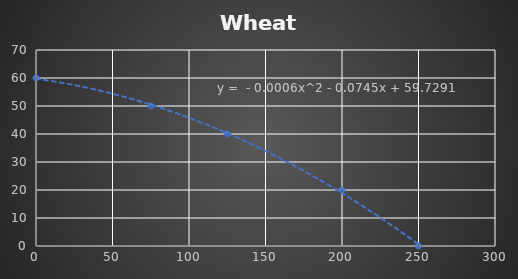
| Category | Series 0 |
|---|---|
| 0.0 | 60 |
| 75.0 | 50 |
| 125.0 | 40 |
| 200.0 | 20 |
| 250.0 | 0 |